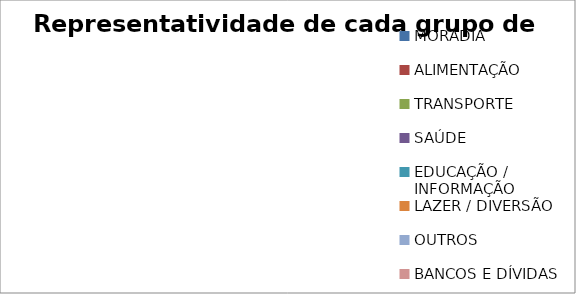
| Category | Series 0 |
|---|---|
| MORADIA | 0 |
| ALIMENTAÇÃO | 0 |
| TRANSPORTE | 0 |
| SAÚDE | 0 |
| EDUCAÇÃO / INFORMAÇÃO | 0 |
| LAZER / DIVERSÃO | 0 |
| OUTROS | 0 |
| BANCOS E DÍVIDAS | 0 |